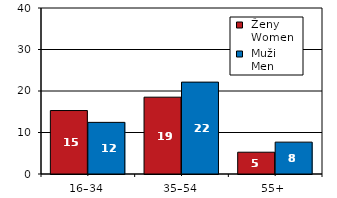
| Category |  Ženy 
 Women |  Muži 
 Men |
|---|---|---|
| 16–34 | 15.29 | 12.44 |
| 35–54 | 18.51 | 22.14 |
| 55+  | 5.25 | 7.68 |